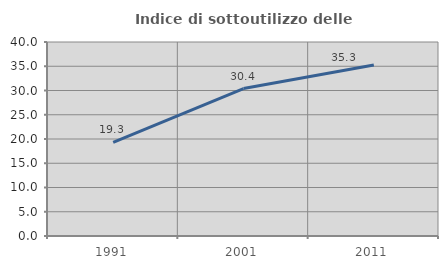
| Category | Indice di sottoutilizzo delle abitazioni  |
|---|---|
| 1991.0 | 19.294 |
| 2001.0 | 30.396 |
| 2011.0 | 35.259 |